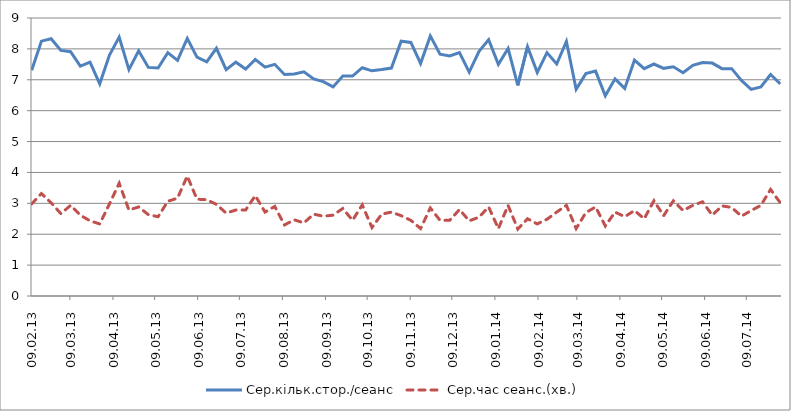
| Category | Сер.кільк.стор./сеанс | Сер.час сеанс.(хв.) |
|---|---|---|
| 2013-02-09 | 7.31 | 2.983 |
| 2013-02-16 | 8.25 | 3.317 |
| 2013-02-23 | 8.33 | 3.017 |
| 2013-03-02 | 7.95 | 2.667 |
| 2013-03-09 | 7.91 | 2.933 |
| 2013-03-16 | 7.44 | 2.617 |
| 2013-03-23 | 7.57 | 2.433 |
| 2013-03-30 | 6.87 | 2.333 |
| 2013-04-06 | 7.8 | 2.983 |
| 2013-04-13 | 8.38 | 3.65 |
| 2013-04-20 | 7.33 | 2.783 |
| 2013-04-27 | 7.94 | 2.883 |
| 2013-05-04 | 7.4 | 2.633 |
| 2013-05-11 | 7.38 | 2.567 |
| 2013-05-18 | 7.88 | 3.067 |
| 2013-05-25 | 7.63 | 3.167 |
| 2013-06-01 | 8.34 | 3.883 |
| 2013-06-08 | 7.73 | 3.133 |
| 2013-06-15 | 7.58 | 3.117 |
| 2013-06-22 | 8.02 | 2.967 |
| 2013-06-29 | 7.33 | 2.683 |
| 2013-07-06 | 7.57 | 2.783 |
| 2013-07-13 | 7.35 | 2.783 |
| 2013-07-20 | 7.66 | 3.25 |
| 2013-07-27 | 7.41 | 2.717 |
| 2013-08-03 | 7.5 | 2.9 |
| 2013-08-10 | 7.17 | 2.3 |
| 2013-08-17 | 7.19 | 2.467 |
| 2013-08-24 | 7.26 | 2.367 |
| 2013-08-31 | 7.03 | 2.65 |
| 2013-09-07 | 6.94 | 2.583 |
| 2013-09-14 | 6.77 | 2.617 |
| 2013-09-21 | 7.12 | 2.833 |
| 2013-09-28 | 7.12 | 2.45 |
| 2013-10-05 | 7.39 | 2.95 |
| 2013-10-12 | 7.29 | 2.217 |
| 2013-10-19 | 7.33 | 2.65 |
| 2013-10-26 | 7.38 | 2.717 |
| 2013-11-02 | 8.25 | 2.6 |
| 2013-11-09 | 8.21 | 2.45 |
| 2013-11-16 | 7.53 | 2.183 |
| 2013-11-23 | 8.42 | 2.85 |
| 2013-11-30 | 7.83 | 2.45 |
| 2013-12-07 | 7.77 | 2.45 |
| 2013-12-14 | 7.88 | 2.8 |
| 2013-12-21 | 7.25 | 2.433 |
| 2013-12-28 | 7.91 | 2.55 |
| 2014-01-04 | 8.3 | 2.883 |
| 2014-01-11 | 7.5 | 2.183 |
| 2014-01-18 | 8.01 | 2.933 |
| 2014-01-25 | 6.82 | 2.167 |
| 2014-02-01 | 8.07 | 2.5 |
| 2014-02-08 | 7.24 | 2.333 |
| 2014-02-15 | 7.88 | 2.483 |
| 2014-02-22 | 7.51 | 2.717 |
| 2014-03-01 | 8.24 | 2.933 |
| 2014-03-08 | 6.69 | 2.183 |
| 2014-03-15 | 7.2 | 2.7 |
| 2014-03-22 | 7.28 | 2.883 |
| 2014-03-29 | 6.48 | 2.267 |
| 2014-04-05 | 7.03 | 2.717 |
| 2014-04-12 | 6.72 | 2.567 |
| 2014-04-19 | 7.64 | 2.767 |
| 2014-04-26 | 7.36 | 2.5 |
| 2014-05-03 | 7.51 | 3.083 |
| 2014-05-10 | 7.37 | 2.6 |
| 2014-05-17 | 7.42 | 3.083 |
| 2014-05-24 | 7.23 | 2.767 |
| 2014-05-31 | 7.47 | 2.933 |
| 2014-06-07 | 7.56 | 3.05 |
| 2014-06-14 | 7.54 | 2.617 |
| 2014-06-21 | 7.36 | 2.917 |
| 2014-06-28 | 7.36 | 2.867 |
| 2014-07-05 | 6.98 | 2.583 |
| 2014-07-12 | 6.69 | 2.767 |
| 2014-07-19 | 6.77 | 2.933 |
| 2014-07-26 | 7.17 | 3.45 |
| 2014-08-02 | 6.87 | 3.017 |